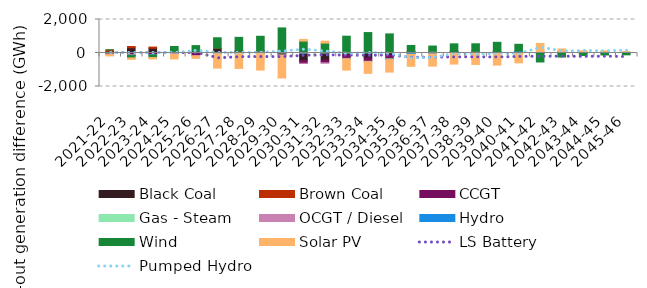
| Category | Black Coal | Brown Coal | CCGT | Gas - Steam | OCGT / Diesel | Hydro | Wind | Solar PV |
|---|---|---|---|---|---|---|---|---|
| 2021-22 | 101.184 | 84.969 | -67.534 | -6.052 | -13.49 | -2.046 | 0.815 | -85.806 |
| 2022-23 | 311.883 | 75.732 | -117.039 | -2.408 | -22.489 | -13.178 | -139.709 | -88.017 |
| 2023-24 | 283.933 | 69.997 | -99.693 | -1.196 | -14.015 | -8.891 | -148.038 | -83.38 |
| 2024-25 | 65.237 | -4.141 | -32.356 | 0.979 | -31.227 | 5.068 | 319.456 | -287.136 |
| 2025-26 | 22.922 | 13.013 | -156.633 | 0 | -21.03 | 13.311 | 392.836 | -146.127 |
| 2026-27 | 275.183 | 14.332 | -20.93 | -1.445 | -5.666 | -13.82 | 620.228 | -861.413 |
| 2027-28 | 107.07 | 7.021 | -9.933 | -0.227 | -6.74 | -11.001 | 820.062 | -894.16 |
| 2028-29 | 113.455 | 12.348 | -6.359 | 0 | 0.005 | -4.557 | 872.611 | -1010.134 |
| 2029-30 | -17.95 | 6.488 | -112.059 | 0 | -0.953 | -0.603 | 1491.612 | -1360.639 |
| 2030-31 | -445.18 | 1.676 | -166.81 | 0 | -7.259 | 40.468 | 668.682 | 101.52 |
| 2031-32 | -421.966 | 3.643 | -162.922 | 0.11 | -7.541 | 5.579 | 580.15 | 118.172 |
| 2032-33 | -120.571 | -6.023 | -193.157 | 0.317 | -9.048 | -14.281 | 1003.336 | -678.844 |
| 2033-34 | -297.191 | 0.571 | -199.073 | -8.667 | -14.28 | 11.164 | 1208.969 | -695.535 |
| 2034-35 | -122.085 | 29.177 | -224.434 | -36.907 | -19.449 | 10.837 | 1100.948 | -738.06 |
| 2035-36 | 83.736 | 9.414 | -18.006 | -6.999 | 1.564 | -51.355 | 355.621 | -721.736 |
| 2036-37 | 77.646 | 15.97 | 11.025 | 1.534 | -2.718 | -51.38 | 309.527 | -728.224 |
| 2037-38 | 50.497 | 20.973 | 6.081 | 3.852 | 1.846 | 0.974 | 461.846 | -660.637 |
| 2038-39 | 97.058 | 1.293 | -16.397 | -0.06 | 3.377 | -4.245 | 447.527 | -663.198 |
| 2039-40 | 44.023 | 15.265 | 20.03 | 0 | 3.965 | -4.99 | 553.951 | -719.588 |
| 2040-41 | 64.245 | 8.329 | 15.942 | 0 | 21.356 | 4.047 | 405.733 | -589.347 |
| 2041-42 | 26.277 | 6.605 | 16.594 | 0 | 1.166 | -11.211 | -524.073 | 519.651 |
| 2042-43 | 41.935 | 0.426 | 16.659 | 0 | 14.752 | 7.844 | -240.835 | 159.796 |
| 2043-44 | 27.171 | 1.983 | 9.286 | 0 | 2.815 | -4.459 | -146.539 | 90.009 |
| 2044-45 | 25.981 | 3.391 | 15.345 | 0 | -3.834 | 7.421 | -114.583 | 76.818 |
| 2045-46 | 14.466 | 5.704 | 5.121 | 0 | 3.954 | 3.559 | -109.819 | 57.906 |